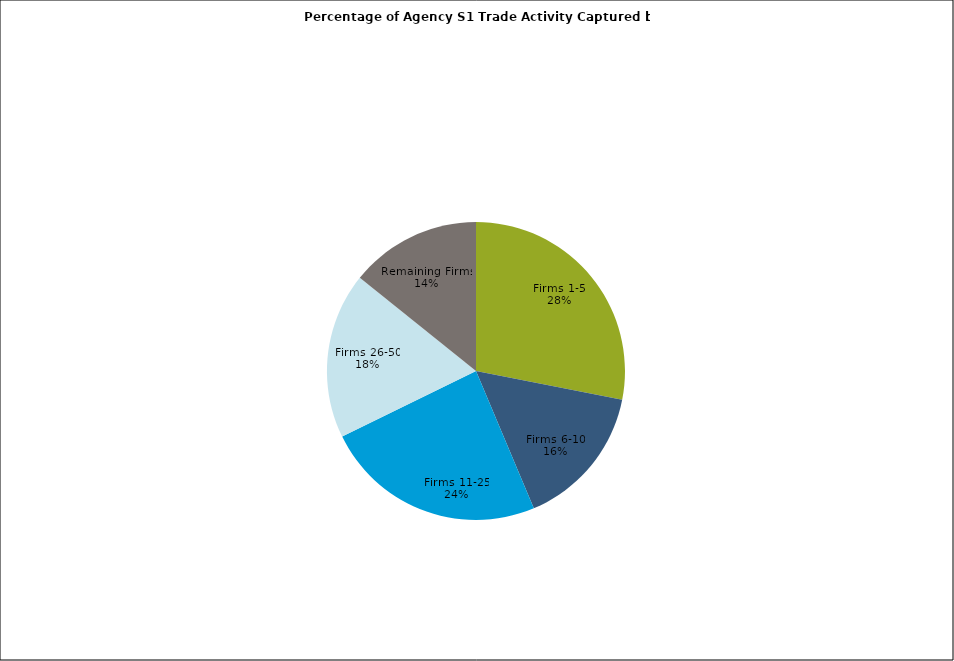
| Category | Series 0 |
|---|---|
| Firms 1-5 | 0.281 |
| Firms 6-10 | 0.156 |
| Firms 11-25 | 0.241 |
| Firms 26-50 | 0.18 |
| Remaining Firms | 0.142 |